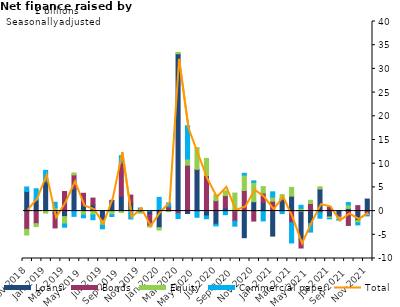
| Category | Loans | Bonds | Equity | Commercial paper |
|---|---|---|---|---|
| Nov-2018 | 4.134 | -3.846 | -1.196 | 0.958 |
| Dec-2018 | 2.301 | -2.65 | -0.623 | 2.407 |
| Jan-2019 | 6.129 | 0.161 | -0.435 | 2.312 |
| Feb-2019 | -0.466 | -3.084 | 0.682 | 1.181 |
| Mar-2019 | -1.159 | 4.131 | -1.561 | -0.683 |
| Apr-2019 | 4.715 | 2.92 | 0.413 | -1.109 |
| May-2019 | 1.133 | 2.622 | -0.845 | -0.561 |
| Jun-2019 | 1.309 | 1.437 | -0.813 | -1.001 |
| Jul-2019 | -1.771 | -0.281 | -0.936 | -0.742 |
| Aug-2019 | 2.099 | 0.174 | -0.783 | -0.357 |
| Sep-2019 | 3.158 | 6.981 | -0.278 | 1.548 |
| Oct-2019 | 1.729 | 1.651 | -0.253 | -1.416 |
| Nov-2019 | -0.129 | -0.195 | -0.109 | 0.654 |
| Dec-2019 | -0.717 | -2.415 | -0.218 | 0.031 |
| Jan-2020 | -3.484 | 0.155 | -0.502 | 2.731 |
| Feb-2020 | 0.147 | 0.764 | -0.112 | 0.826 |
| Mar-2020 | 33.19 | -0.54 | 0.288 | -1.041 |
| Apr-2020 | -0.507 | 9.698 | 1.295 | 7.014 |
| May-2020 | 8.695 | 0.131 | 4.566 | -1.303 |
| Jun-2020 | -1.04 | 7.494 | 3.614 | -0.564 |
| Jul-2020 | -2.78 | 2.212 | 1.242 | -0.34 |
| Aug-2020 | 0.653 | 2.614 | 1.01 | -0.762 |
| Sep-2020 | 0.055 | -2.122 | 3.753 | -1.058 |
| Oct-2020 | -5.609 | 4.349 | 3.257 | 0.366 |
| Nov-2020 | 1.983 | -2.106 | 4.076 | 0.327 |
| Dec-2020 | 1.782 | 2.015 | 1.365 | -2.076 |
| Jan-2021 | -5.274 | 2.081 | 0.878 | 1.11 |
| Feb-2021 | 2.376 | 0.193 | 0.907 | -0.517 |
| Mar-2021 | 3.148 | -2.452 | 1.861 | -4.272 |
| Apr-2021 | -6.038 | -1.754 | 0.579 | 0.65 |
| May-2021 | -2.615 | 1.596 | 0.689 | -1.817 |
| Jun-2021 | 4.674 | -0.338 | 0.467 | -1.166 |
| Jul-2021 | -1.231 | 0.867 | -0.328 | -0.072 |
| Aug-2021 | -0.778 | -0.499 | -0.494 | -0.136 |
| Sep-2021 | 0.556 | -3.026 | 0.762 | 0.481 |
| Oct-2021 | -2.003 | 1.158 | -0.463 | -0.446 |
| Nov-2021 | 2.544 | -0.729 | -0.171 | -0.107 |